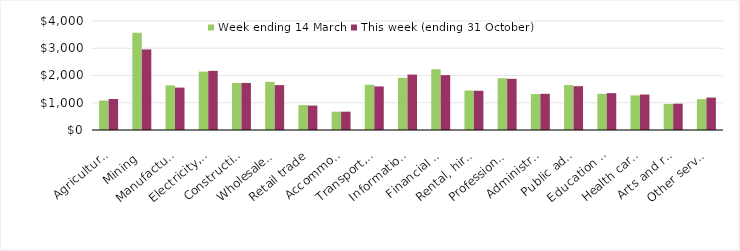
| Category | Week ending 14 March | This week (ending 31 October) |
|---|---|---|
| Agriculture, forestry and fishing | 1081.48 | 1136.95 |
| Mining | 3568.05 | 2956.44 |
| Manufacturing | 1637.27 | 1556.37 |
| Electricity, gas, water and waste services | 2142.73 | 2170.34 |
| Construction | 1725.1 | 1726.99 |
| Wholesale trade | 1766.76 | 1648.08 |
| Retail trade | 913.03 | 895.96 |
| Accommodation and food services | 673.07 | 672.79 |
| Transport, postal and warehousing | 1660.46 | 1599.62 |
| Information media and telecommunications | 1914.2 | 2032.68 |
| Financial and insurance services | 2228.65 | 2014.5 |
| Rental, hiring and real estate services | 1447.73 | 1440.79 |
| Professional, scientific and technical services | 1898.78 | 1877.06 |
| Administrative and support services | 1317.22 | 1327.51 |
| Public administration and safety | 1648.17 | 1608.15 |
| Education and training | 1325.31 | 1352.7 |
| Health care and social assistance | 1269.76 | 1300.84 |
| Arts and recreation services | 958.37 | 965.74 |
| Other services | 1130.83 | 1189.63 |